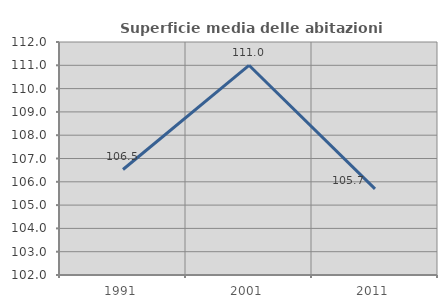
| Category | Superficie media delle abitazioni occupate |
|---|---|
| 1991.0 | 106.528 |
| 2001.0 | 111 |
| 2011.0 | 105.695 |